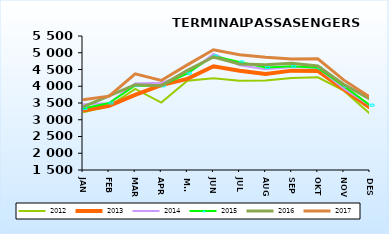
| Category | 2012 | 2013 | 2014 | 2015 | 2016 | 2017 |
|---|---|---|---|---|---|---|
| JAN | 3220075 | 3277804 | 3466027 | 3335025 | 3387711 | 3598087 |
| FEB | 3404233 | 3418955 | 3490096 | 3499805 | 3709601 | 3705178 |
| MAR | 3921986 | 3741673 | 4084303 | 4024348 | 4047045 | 4371756 |
| APR | 3513324 | 4035227 | 4104568 | 4012574 | 4017903 | 4171684 |
| MAI | 4162586 | 4220892 | 4362500 | 4386314 | 4472058 | 4637714 |
| JUN | 4239487 | 4597152 | 4964668 | 4903813 | 4872167 | 5088909 |
| JUL | 4166402 | 4462056 | 4626037 | 4726456 | 4662316 | 4939296 |
| AUG | 4168293 | 4364289 | 4506205 | 4560026 | 4643236 | 4865456 |
| SEP | 4247675 | 4466332 | 4572855 | 4597268 | 4686199 | 4810992 |
| OKT | 4267971 | 4457440 | 4552635 | 4549491 | 4603908 | 4818612 |
| NOV | 3869288 | 3904581 | 3925316 | 4001911 | 4052458 | 4182127 |
| DES | 3176348 | 3363415 | 3428848 | 3435259 | 3619176 | 3675570 |